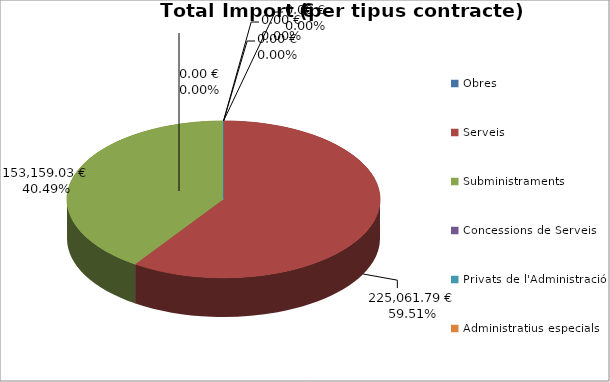
| Category | Total preu              (amb iva) |
|---|---|
| Obres | 0 |
| Serveis | 225061.79 |
| Subministraments | 153159.03 |
| Concessions de Serveis | 0 |
| Privats de l'Administració | 0 |
| Administratius especials | 0 |